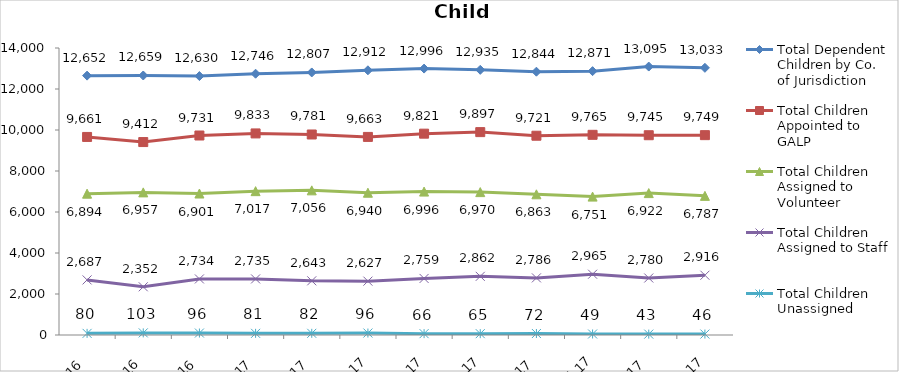
| Category | Total Dependent Children by Co. of Jurisdiction | Total Children Appointed to GALP | Total Children Assigned to Volunteer | Total Children Assigned to Staff | Total Children Unassigned |
|---|---|---|---|---|---|
| 2016-10-01 | 12652 | 9661 | 6894 | 2687 | 80 |
| 2016-11-01 | 12659 | 9412 | 6957 | 2352 | 103 |
| 2016-12-01 | 12630 | 9731 | 6901 | 2734 | 96 |
| 2017-01-01 | 12746 | 9833 | 7017 | 2735 | 81 |
| 2017-02-01 | 12807 | 9781 | 7056 | 2643 | 82 |
| 2017-03-01 | 12912 | 9663 | 6940 | 2627 | 96 |
| 2017-04-01 | 12996 | 9821 | 6996 | 2759 | 66 |
| 2017-05-01 | 12935 | 9897 | 6970 | 2862 | 65 |
| 2017-06-01 | 12844 | 9721 | 6863 | 2786 | 72 |
| 2017-07-01 | 12871 | 9765 | 6751 | 2965 | 49 |
| 2017-08-01 | 13095 | 9745 | 6922 | 2780 | 43 |
| 2017-09-01 | 13033 | 9749 | 6787 | 2916 | 46 |